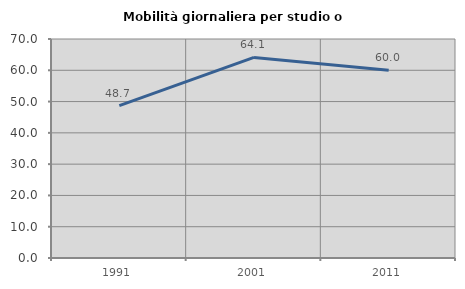
| Category | Mobilità giornaliera per studio o lavoro |
|---|---|
| 1991.0 | 48.71 |
| 2001.0 | 64.114 |
| 2011.0 | 60.024 |